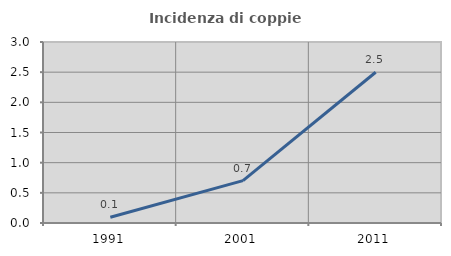
| Category | Incidenza di coppie miste |
|---|---|
| 1991.0 | 0.095 |
| 2001.0 | 0.702 |
| 2011.0 | 2.499 |